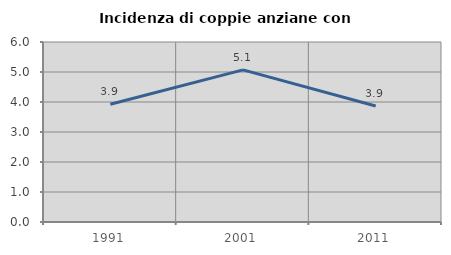
| Category | Incidenza di coppie anziane con figli |
|---|---|
| 1991.0 | 3.925 |
| 2001.0 | 5.07 |
| 2011.0 | 3.867 |